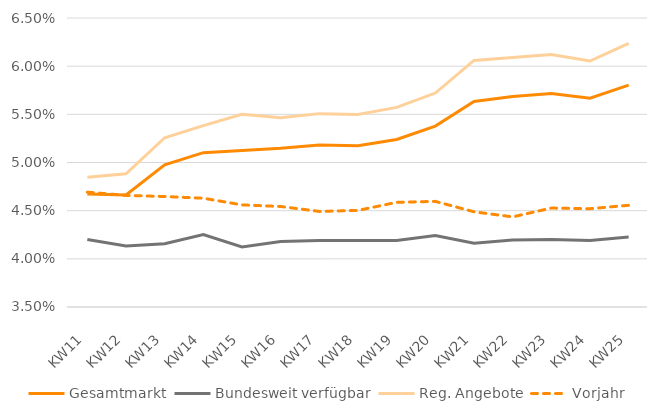
| Category | Gesamtmarkt | Bundesweit verfügbar | Reg. Angebote | Vorjahr |
|---|---|---|---|---|
| KW11 | 0.047 | 0.042 | 0.048 | 0.047 |
| KW12 | 0.047 | 0.041 | 0.049 | 0.047 |
| KW13 | 0.05 | 0.042 | 0.053 | 0.046 |
| KW14 | 0.051 | 0.043 | 0.054 | 0.046 |
| KW15 | 0.051 | 0.041 | 0.055 | 0.046 |
| KW16 | 0.051 | 0.042 | 0.055 | 0.045 |
| KW17 | 0.052 | 0.042 | 0.055 | 0.045 |
| KW18 | 0.052 | 0.042 | 0.055 | 0.045 |
| KW19 | 0.052 | 0.042 | 0.056 | 0.046 |
| KW20 | 0.054 | 0.042 | 0.057 | 0.046 |
| KW21 | 0.056 | 0.042 | 0.061 | 0.045 |
| KW22 | 0.057 | 0.042 | 0.061 | 0.044 |
| KW23 | 0.057 | 0.042 | 0.061 | 0.045 |
| KW24 | 0.057 | 0.042 | 0.061 | 0.045 |
| KW25 | 0.058 | 0.042 | 0.062 | 0.046 |